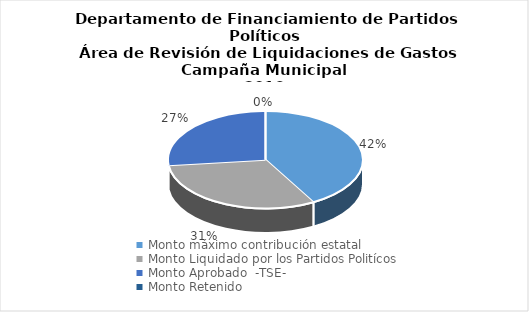
| Category | Series 0 |
|---|---|
| Monto máximo contribución estatal  | 6379239274.521 |
| Monto Liquidado por los Partidos Politícos | 4779571371.48 |
| Monto Aprobado  -TSE- | 4089652518.45 |
| Monto Retenido  | 0 |